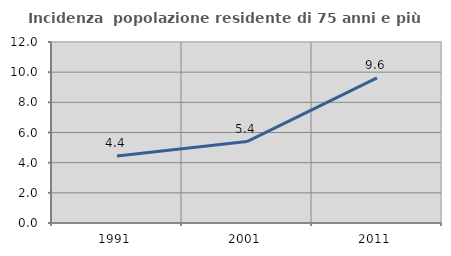
| Category | Incidenza  popolazione residente di 75 anni e più |
|---|---|
| 1991.0 | 4.443 |
| 2001.0 | 5.399 |
| 2011.0 | 9.626 |